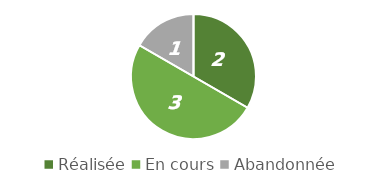
| Category | Series 0 |
|---|---|
| Réalisée | 2 |
| En cours | 3 |
| Abandonnée | 1 |